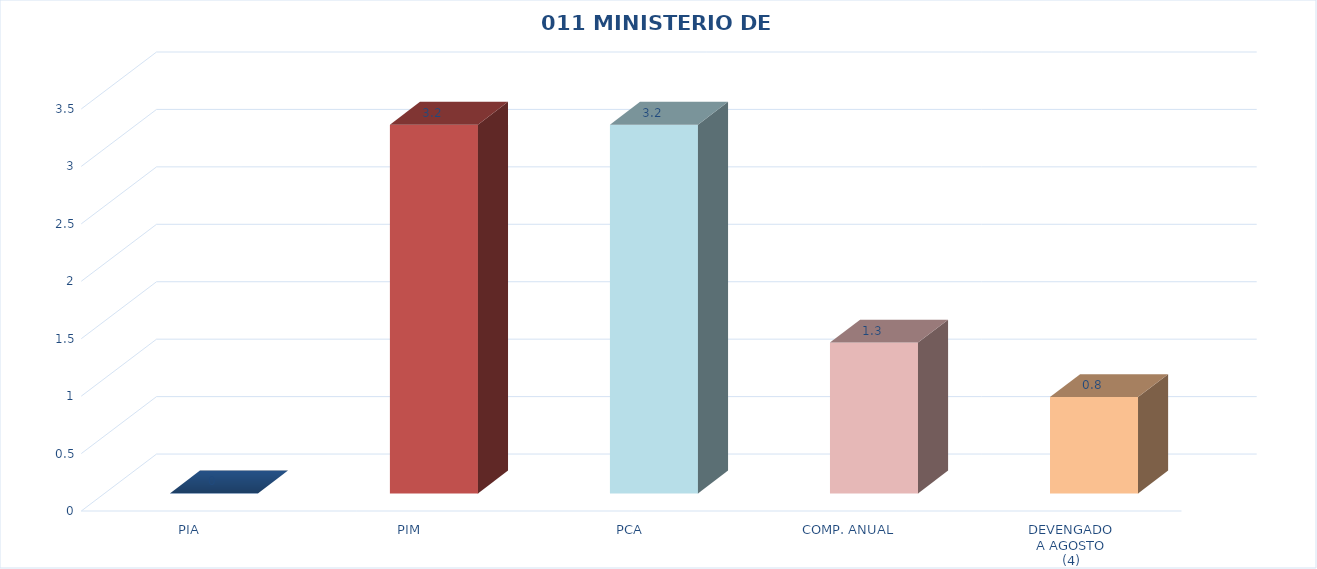
| Category | 011 MINISTERIO DE SALUD |
|---|---|
| PIA | 0 |
| PIM | 3.21 |
| PCA | 3.21 |
| COMP. ANUAL | 1.313 |
| DEVENGADO
A AGOSTO
(4) | 0.839 |